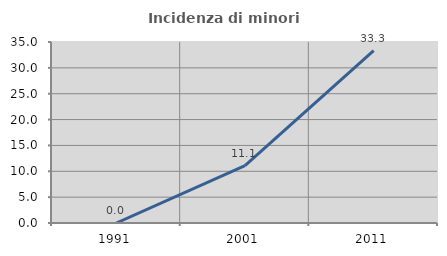
| Category | Incidenza di minori stranieri |
|---|---|
| 1991.0 | 0 |
| 2001.0 | 11.111 |
| 2011.0 | 33.333 |